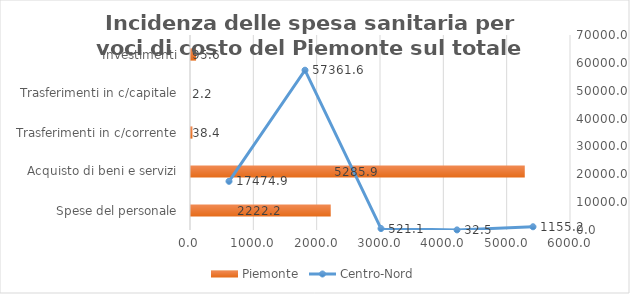
| Category | Piemonte |
|---|---|
| Spese del personale | 2222.23 |
| Acquisto di beni e servizi | 5285.91 |
| Trasferimenti in c/corrente | 38.41 |
| Trasferimenti in c/capitale | 2.22 |
| Investimenti | 95.61 |